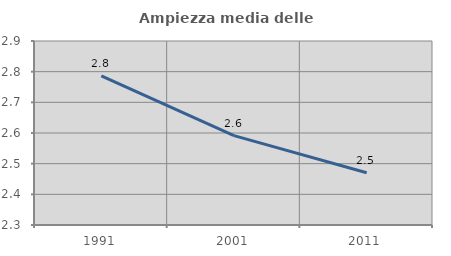
| Category | Ampiezza media delle famiglie |
|---|---|
| 1991.0 | 2.786 |
| 2001.0 | 2.592 |
| 2011.0 | 2.471 |